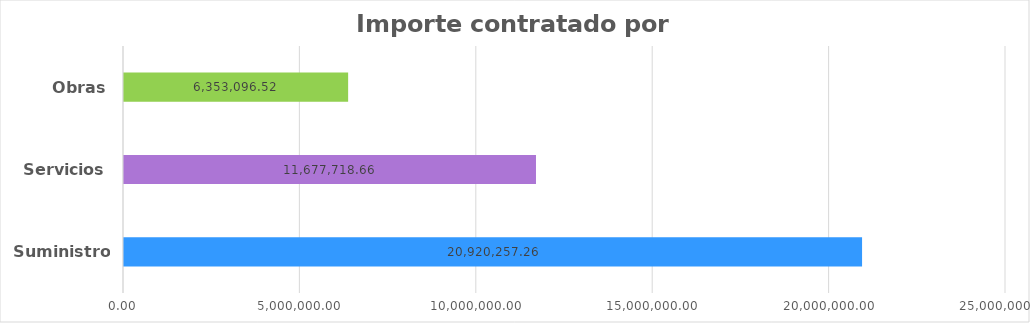
| Category | Series 0 |
|---|---|
| Suministros | 20920257.255 |
| Servicios | 11677718.661 |
| Obras | 6353096.52 |